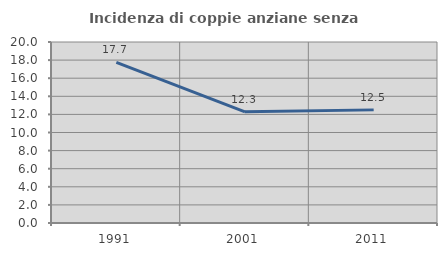
| Category | Incidenza di coppie anziane senza figli  |
|---|---|
| 1991.0 | 17.742 |
| 2001.0 | 12.281 |
| 2011.0 | 12.5 |